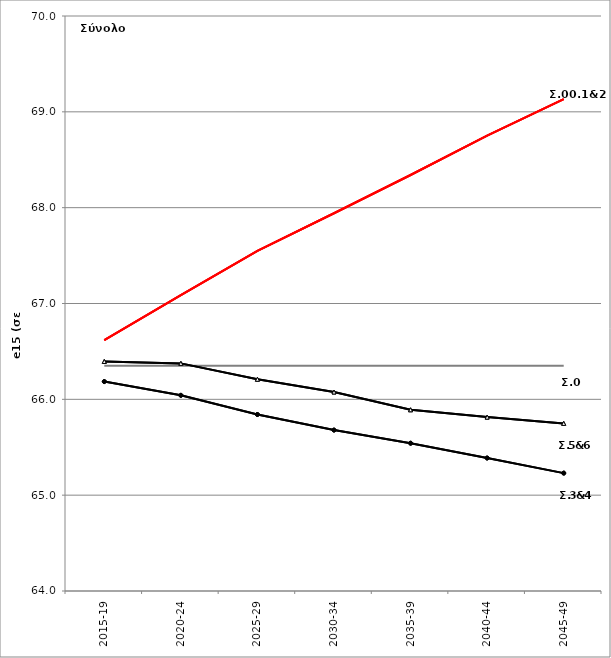
| Category | Σ0.e15 | Σ00.e15 | Σ1.e15 | Σ2.e15 | Σ3.e15 | Σ4.e15 | Σ5.e15 | Σ6.e15 |
|---|---|---|---|---|---|---|---|---|
| 2015-19 | 66.351 | 66.618 | 66.618 | 66.618 | 66.185 | 66.185 | 66.395 | 66.395 |
| 2020-24 | 66.351 | 67.088 | 67.088 | 67.088 | 66.042 | 66.042 | 66.375 | 66.375 |
| 2025-29 | 66.351 | 67.549 | 67.549 | 67.549 | 65.842 | 65.842 | 66.21 | 66.21 |
| 2030-34 | 66.351 | 67.942 | 67.942 | 67.942 | 65.679 | 65.679 | 66.076 | 66.076 |
| 2035-39 | 66.351 | 68.341 | 68.341 | 68.341 | 65.542 | 65.542 | 65.891 | 65.891 |
| 2040-44 | 66.351 | 68.752 | 68.752 | 68.752 | 65.387 | 65.387 | 65.815 | 65.815 |
| 2045-49 | 66.351 | 69.132 | 69.132 | 69.132 | 65.23 | 65.23 | 65.749 | 65.749 |